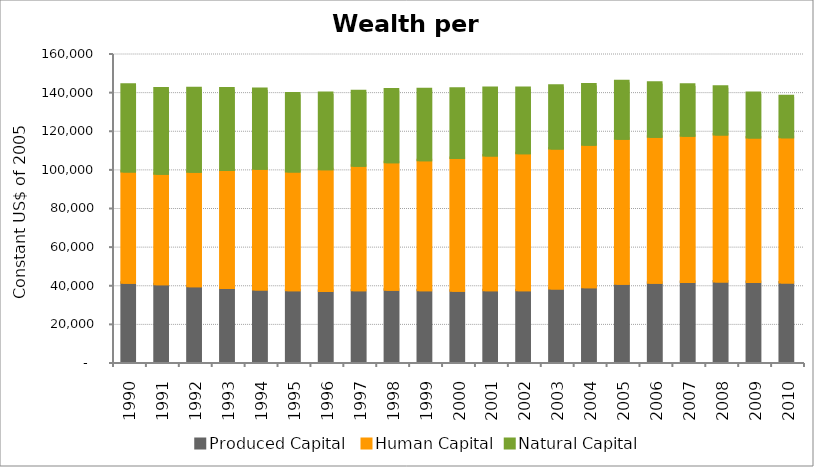
| Category | Produced Capital  | Human Capital | Natural Capital |
|---|---|---|---|
| 1990.0 | 41007.823 | 57617.962 | 44987.088 |
| 1991.0 | 40269.649 | 57258.513 | 44075.151 |
| 1992.0 | 39256.103 | 59298.171 | 43157.612 |
| 1993.0 | 38258.268 | 61098.626 | 42226.05 |
| 1994.0 | 37526.034 | 62569.918 | 41303.258 |
| 1995.0 | 37131.826 | 61555.528 | 40372.051 |
| 1996.0 | 36819.147 | 62982.781 | 39492.065 |
| 1997.0 | 37137.637 | 64486.799 | 38606.201 |
| 1998.0 | 37436.082 | 65966.862 | 37753.16 |
| 1999.0 | 37208.78 | 67195.5 | 36864.1 |
| 2000.0 | 36832.724 | 68737.117 | 35912.862 |
| 2001.0 | 37126.548 | 69821.368 | 34909.047 |
| 2002.0 | 37130.274 | 70895.99 | 33875.827 |
| 2003.0 | 38112.519 | 72398.257 | 32586.739 |
| 2004.0 | 38736.084 | 73791.403 | 31197.917 |
| 2005.0 | 40532.986 | 75053.17 | 29726.011 |
| 2006.0 | 41062.664 | 75524.89 | 28059.088 |
| 2007.0 | 41362.729 | 75776.298 | 26378.929 |
| 2008.0 | 41629.574 | 76160.408 | 24702.382 |
| 2009.0 | 41390.074 | 74850.546 | 23008.538 |
| 2010.0 | 41169.332 | 75162.723 | 21299.282 |